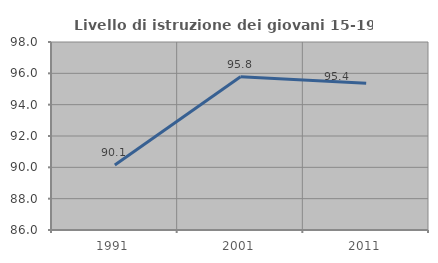
| Category | Livello di istruzione dei giovani 15-19 anni |
|---|---|
| 1991.0 | 90.144 |
| 2001.0 | 95.783 |
| 2011.0 | 95.37 |